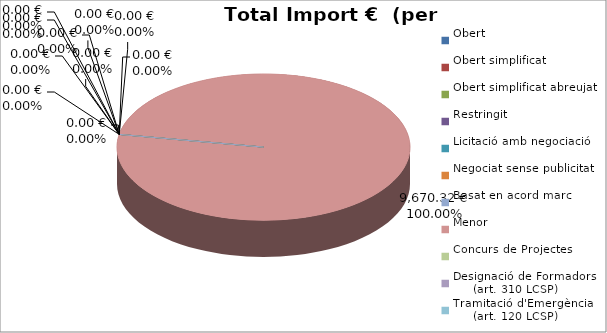
| Category | Total preu
(amb IVA) |
|---|---|
| Obert | 0 |
| Obert simplificat | 0 |
| Obert simplificat abreujat | 0 |
| Restringit | 0 |
| Licitació amb negociació | 0 |
| Negociat sense publicitat | 0 |
| Basat en acord marc | 0 |
| Menor | 9670.32 |
| Concurs de Projectes | 0 |
| Designació de Formadors
     (art. 310 LCSP) | 0 |
| Tramitació d'Emergència
     (art. 120 LCSP) | 0 |